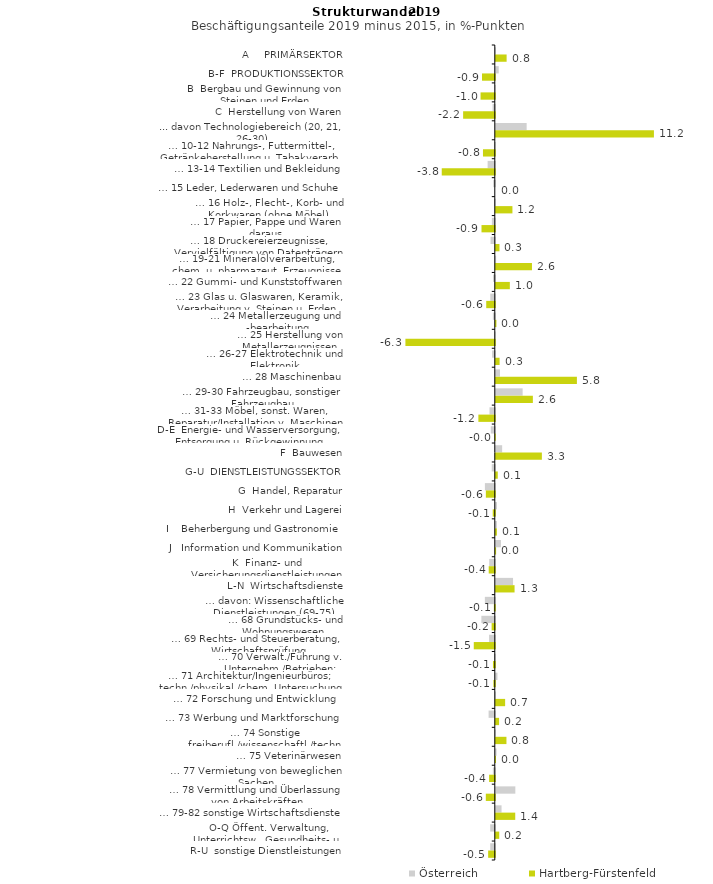
| Category | Österreich | Hartberg-Fürstenfeld |
|---|---|---|
| A     PRIMÄRSEKTOR | 0.009 | 0.768 |
| B-F  PRODUKTIONSSEKTOR | 0.208 | -0.908 |
| B  Bergbau und Gewinnung von Steinen und Erden | -0.008 | -1.012 |
| C  Herstellung von Waren | -0.159 | -2.249 |
| ... davon Technologiebereich (20, 21, 26-30) | 2.191 | 11.23 |
| … 10-12 Nahrungs-, Futtermittel-, Getränkeherstellung u. Tabakverarb. | -0.044 | -0.841 |
| … 13-14 Textilien und Bekleidung | -0.51 | -3.769 |
| … 15 Leder, Lederwaren und Schuhe | -0.114 | 0 |
| … 16 Holz-, Flecht-, Korb- und Korkwaren (ohne Möbel)  | -0.049 | 1.181 |
| … 17 Papier, Pappe und Waren daraus  | -0.209 | -0.945 |
| … 18 Druckereierzeugnisse, Vervielfältigung von Datenträgern | -0.302 | 0.261 |
| … 19-21 Mineralölverarbeitung, chem. u. pharmazeut. Erzeugnisse | 0.022 | 2.569 |
| … 22 Gummi- und Kunststoffwaren | -0.128 | 0.997 |
| … 23 Glas u. Glaswaren, Keramik, Verarbeitung v. Steinen u. Erden  | -0.322 | -0.609 |
| … 24 Metallerzeugung und -bearbeitung | -0.136 | 0.045 |
| … 25 Herstellung von Metallerzeugnissen  | -0.032 | -6.349 |
| … 26-27 Elektrotechnik und Elektronik | -0.193 | 0.269 |
| … 28 Maschinenbau | 0.297 | 5.76 |
| … 29-30 Fahrzeugbau, sonstiger Fahrzeugbau | 1.906 | 2.632 |
| … 31-33 Möbel, sonst. Waren, Reparatur/Installation v. Maschinen | -0.377 | -1.167 |
| D-E  Energie- und Wasserversorgung, Entsorgung u. Rückgewinnung | -0.284 | -0.022 |
| F  Bauwesen | 0.45 | 3.272 |
| G-U  DIENSTLEISTUNGSSEKTOR | -0.217 | 0.14 |
| G  Handel, Reparatur | -0.703 | -0.635 |
| H  Verkehr und Lagerei | 0.083 | -0.147 |
| I    Beherbergung und Gastronomie | 0.078 | 0.078 |
| J   Information und Kommunikation | 0.366 | 0.021 |
| K  Finanz- und Versicherungsdienstleistungen | -0.397 | -0.432 |
| L-N  Wirtschaftsdienste | 1.224 | 1.333 |
| … davon: Wissenschaftliche Dienstleistungen (69-75) | -0.706 | -0.067 |
| … 68 Grundstücks- und Wohnungswesen  | -0.954 | -0.226 |
| … 69 Rechts- und Steuerberatung, Wirtschaftsprüfung | -0.408 | -1.493 |
| … 70 Verwalt./Führung v. Unternehm./Betrieben; Unternehmensberat. | -0.052 | -0.13 |
| … 71 Architektur/Ingenieurbüros; techn./physikal./chem. Untersuchung | 0.116 | -0.1 |
| … 72 Forschung und Entwicklung  | 0.013 | 0.663 |
| … 73 Werbung und Marktforschung | -0.44 | 0.233 |
| … 74 Sonstige freiberufl./wissenschaftl./techn. Tätigkeiten | 0.011 | 0.756 |
| … 75 Veterinärwesen | 0.053 | 0.014 |
| … 77 Vermietung von beweglichen Sachen  | -0.137 | -0.404 |
| … 78 Vermittlung und Überlassung von Arbeitskräften | 1.388 | -0.639 |
| … 79-82 sonstige Wirtschaftsdienste | 0.408 | 1.381 |
| O-Q Öffent. Verwaltung, Unterrichtsw., Gesundheits- u. Sozialwesen | -0.326 | 0.244 |
| R-U  sonstige Dienstleistungen | -0.326 | -0.473 |